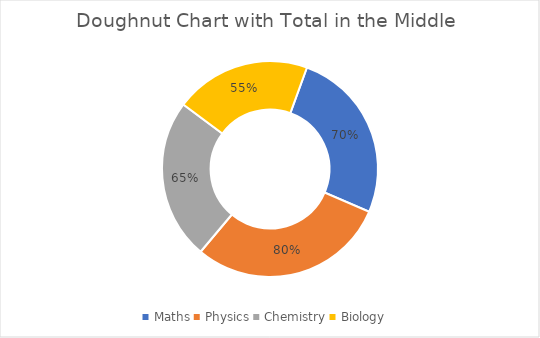
| Category | Series 0 |
|---|---|
| Maths | 0.7 |
| Physics | 0.8 |
| Chemistry | 0.65 |
| Biology | 0.55 |